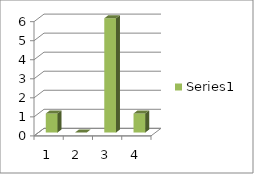
| Category | Series 0 |
|---|---|
| 0 | 1 |
| 1 | 0 |
| 2 | 6 |
| 3 | 1 |